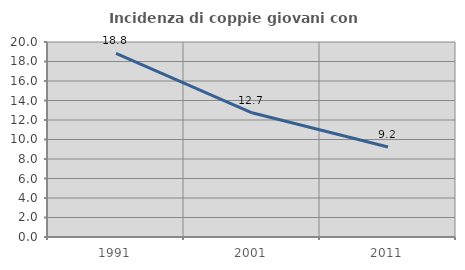
| Category | Incidenza di coppie giovani con figli |
|---|---|
| 1991.0 | 18.841 |
| 2001.0 | 12.743 |
| 2011.0 | 9.225 |